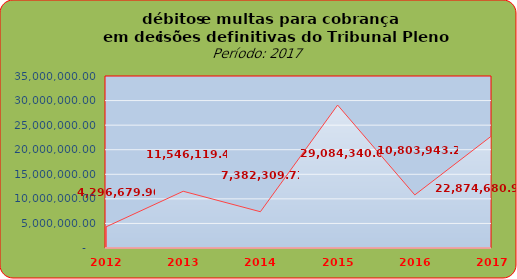
| Category | Series 0 |
|---|---|
| 2012.0 | 4296679.9 |
| 2013.0 | 11546119.49 |
| 2014.0 | 7382309.72 |
| 2015.0 | 29084340.08 |
| 2016.0 | 10803943.29 |
| 2017.0 | 22874680.97 |